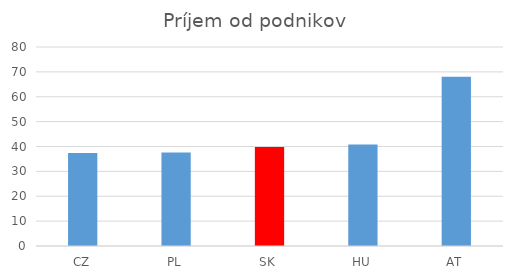
| Category | Príjem od podnikov |
|---|---|
| CZ | 37.433 |
| PL | 37.633 |
| SK | 39.833 |
| HU | 40.8 |
| AT | 68.033 |